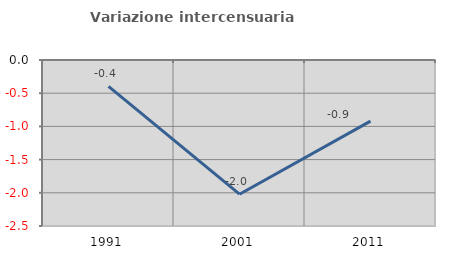
| Category | Variazione intercensuaria annua |
|---|---|
| 1991.0 | -0.397 |
| 2001.0 | -2.021 |
| 2011.0 | -0.921 |